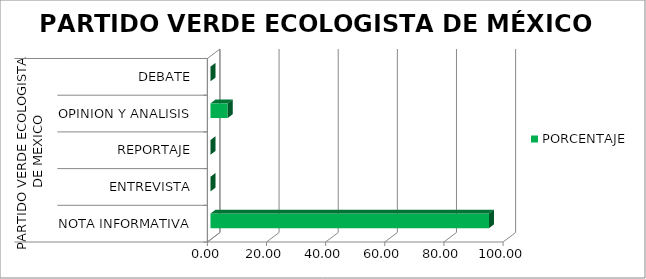
| Category | PORCENTAJE |
|---|---|
| 0 | 94.186 |
| 1 | 0 |
| 2 | 0 |
| 3 | 5.814 |
| 4 | 0 |